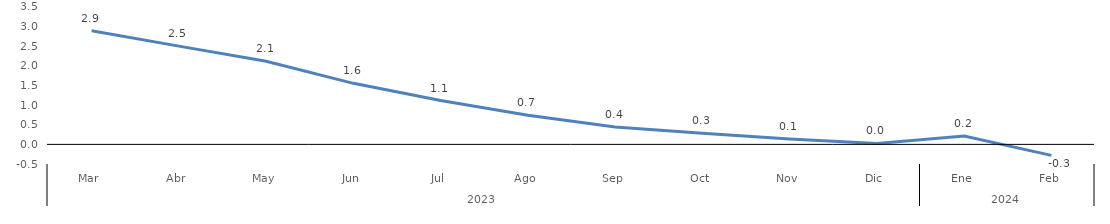
| Category | Bogotá |
|---|---|
| 0 | 2.894 |
| 1 | 2.503 |
| 2 | 2.116 |
| 3 | 1.555 |
| 4 | 1.116 |
| 5 | 0.745 |
| 6 | 0.445 |
| 7 | 0.286 |
| 8 | 0.135 |
| 9 | 0.022 |
| 10 | 0.21 |
| 11 | -0.281 |